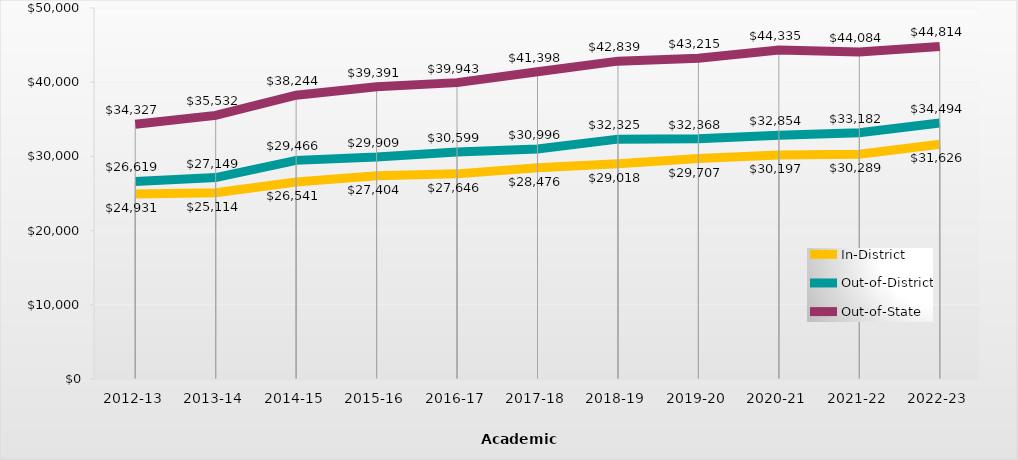
| Category | In-District | Out-of-District | Out-of-State |
|---|---|---|---|
| 2012-13 | 24931 | 26619 | 34327 |
| 2013-14 | 25114.27 | 27148.6 | 35532.25 |
| 2014-15 | 26541.34 | 29465.87 | 38243.8 |
| 2015-16 | 27404 | 29909 | 39391 |
| 2016-17 | 27646 | 30599 | 39943 |
| 2017-18 | 28476 | 30996 | 41398 |
| 2018-19 | 29018 | 32325 | 42839 |
| 2019-20 | 29707 | 32368 | 43215 |
| 2020-21 | 30197 | 32854 | 44335 |
| 2021-22 | 30289 | 33182 | 44084 |
| 2022-23 | 31626 | 34494 | 44814 |